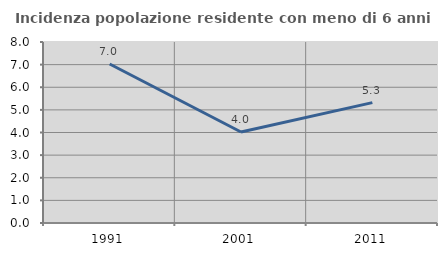
| Category | Incidenza popolazione residente con meno di 6 anni |
|---|---|
| 1991.0 | 7.028 |
| 2001.0 | 4.022 |
| 2011.0 | 5.319 |